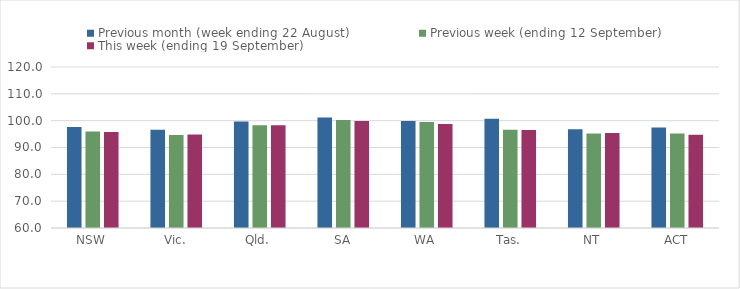
| Category | Previous month (week ending 22 August) | Previous week (ending 12 September) | This week (ending 19 September) |
|---|---|---|---|
| NSW | 97.6 | 95.94 | 95.75 |
| Vic. | 96.58 | 94.67 | 94.87 |
| Qld. | 99.67 | 98.28 | 98.28 |
| SA | 101.21 | 100.27 | 99.87 |
| WA | 99.91 | 99.54 | 98.74 |
| Tas. | 100.72 | 96.66 | 96.49 |
| NT | 96.79 | 95.21 | 95.37 |
| ACT | 97.5 | 95.21 | 94.76 |